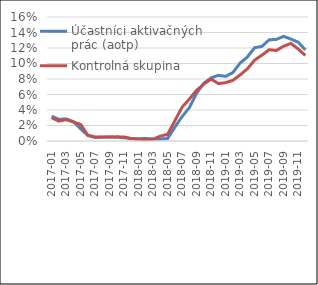
| Category | Účastníci aktivačných prác (aotp) | Kontrolná skupina |
|---|---|---|
| 2017-01 | 0.032 | 0.03 |
| 2017-02 | 0.028 | 0.026 |
| 2017-03 | 0.029 | 0.028 |
| 2017-04 | 0.025 | 0.025 |
| 2017-05 | 0.016 | 0.021 |
| 2017-06 | 0.007 | 0.008 |
| 2017-07 | 0.005 | 0.005 |
| 2017-08 | 0.005 | 0.005 |
| 2017-09 | 0.005 | 0.005 |
| 2017-10 | 0.005 | 0.005 |
| 2017-11 | 0.004 | 0.005 |
| 2017-12 | 0.003 | 0.003 |
| 2018-01 | 0.003 | 0.002 |
| 2018-02 | 0.003 | 0.002 |
| 2018-03 | 0.003 | 0.002 |
| 2018-04 | 0.003 | 0.006 |
| 2018-05 | 0.003 | 0.009 |
| 2018-06 | 0.018 | 0.026 |
| 2018-07 | 0.031 | 0.044 |
| 2018-08 | 0.043 | 0.054 |
| 2018-09 | 0.062 | 0.065 |
| 2018-10 | 0.075 | 0.073 |
| 2018-11 | 0.081 | 0.08 |
| 2018-12 | 0.085 | 0.074 |
| 2019-01 | 0.083 | 0.075 |
| 2019-02 | 0.088 | 0.078 |
| 2019-03 | 0.101 | 0.085 |
| 2019-04 | 0.108 | 0.093 |
| 2019-05 | 0.12 | 0.104 |
| 2019-06 | 0.122 | 0.111 |
| 2019-07 | 0.13 | 0.118 |
| 2019-08 | 0.131 | 0.117 |
| 2019-09 | 0.135 | 0.122 |
| 2019-10 | 0.131 | 0.126 |
| 2019-11 | 0.128 | 0.119 |
| 2019-12 | 0.117 | 0.11 |